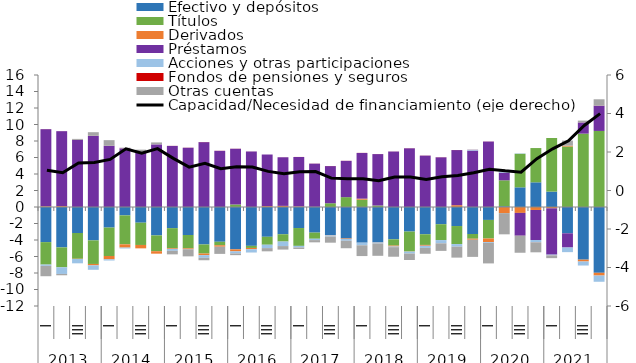
| Category | Efectivo y depósitos | Títulos | Derivados | Préstamos  | Acciones y otras participaciones  | Fondos de pensiones y seguros | Otras cuentas |
|---|---|---|---|---|---|---|---|
| 0 | -4.258 | -2.724 | 0.082 | 9.35 | -0.154 | 0.007 | -1.255 |
| 1 | -4.895 | -2.412 | 0.107 | 9.084 | -0.808 | 0.005 | -0.16 |
| 2 | -3.151 | -3.123 | -0.027 | 8.124 | -0.526 | 0.008 | 0.123 |
| 3 | -4.048 | -2.856 | -0.17 | 8.621 | -0.539 | 0.009 | 0.437 |
| 4 | -2.494 | -3.442 | -0.402 | 7.414 | -0.148 | 0.009 | 0.68 |
| 5 | -1.017 | -3.513 | -0.391 | 7.109 | -0.107 | 0.009 | 0.072 |
| 6 | -1.902 | -2.7 | -0.41 | 6.626 | 0.049 | 0.008 | 0.267 |
| 7 | -3.445 | -1.915 | -0.295 | 7.585 | 0.022 | 0.008 | 0.214 |
| 8 | -2.561 | -2.43 | -0.089 | 7.404 | -0.234 | 0.007 | -0.426 |
| 9 | -3.391 | -1.626 | -0.092 | 7.184 | -0.012 | 0.011 | -0.861 |
| 10 | -4.539 | -1.105 | -0.195 | 7.86 | -0.318 | 0.012 | -0.298 |
| 11 | -4.214 | -0.423 | -0.178 | 6.806 | -0.005 | 0.011 | -0.864 |
| 12 | -5.129 | 0.306 | -0.248 | 6.754 | -0.254 | 0.01 | -0.205 |
| 13 | -4.707 | -0.255 | -0.159 | 6.729 | -0.392 | 0.005 | -0.006 |
| 14 | -3.611 | -0.964 | 0.107 | 6.256 | -0.408 | 0.003 | -0.389 |
| 15 | -3.304 | -0.884 | 0.138 | 5.892 | -0.549 | 0.005 | -0.424 |
| 16 | -2.55 | -2.163 | 0.066 | 5.993 | -0.193 | 0.006 | -0.181 |
| 17 | -3.105 | -0.744 | 0.014 | 5.243 | -0.164 | 0.009 | -0.27 |
| 18 | -3.4 | 0.454 | -0.045 | 4.504 | -0.133 | 0.01 | -0.748 |
| 19 | -3.817 | 1.194 | -0.06 | 4.4 | -0.215 | 0.009 | -0.905 |
| 20 | -4.326 | 0.885 | 0.129 | 5.536 | -0.319 | 0.009 | -1.303 |
| 21 | -4.294 | 0.182 | -0.022 | 6.232 | -0.105 | 0.006 | -1.496 |
| 22 | -3.919 | -0.76 | -0.108 | 6.726 | -0.08 | 0.006 | -1.16 |
| 23 | -2.976 | -2.417 | -0.018 | 7.115 | -0.228 | 0.009 | -0.783 |
| 24 | -3.304 | -1.293 | -0.103 | 6.228 | -0.255 | 0.011 | -0.713 |
| 25 | -2.087 | -1.924 | 0.002 | 6.021 | -0.393 | 0.011 | -0.916 |
| 26 | -2.307 | -2.187 | 0.221 | 6.68 | -0.31 | 0.008 | -1.331 |
| 27 | -3.274 | -0.569 | -0.126 | 6.839 | 0.113 | 0.013 | -2.077 |
| 28 | -1.567 | -2.253 | -0.43 | 7.935 | -0.106 | 0.008 | -2.483 |
| 29 | 0.095 | 3.141 | -0.739 | 0.93 | 0.166 | -0.003 | -2.57 |
| 30 | 2.384 | 4.07 | -0.715 | -2.763 | 0.045 | -0.005 | -2.062 |
| 31 | 2.993 | 4.153 | -0.36 | -3.637 | -0.277 | -0.01 | -1.208 |
| 32 | 1.866 | 6.499 | -0.161 | -5.616 | -0.092 | -0.008 | -0.323 |
| 33 | -3.19 | 7.329 | 0.111 | -1.721 | -0.561 | -0.003 | 0.612 |
| 34 | -6.381 | 8.894 | -0.226 | 1.354 | -0.487 | 0.008 | 0.217 |
| 35 | -7.973 | 9.219 | -0.336 | 3.059 | -0.754 | 0.011 | 0.767 |